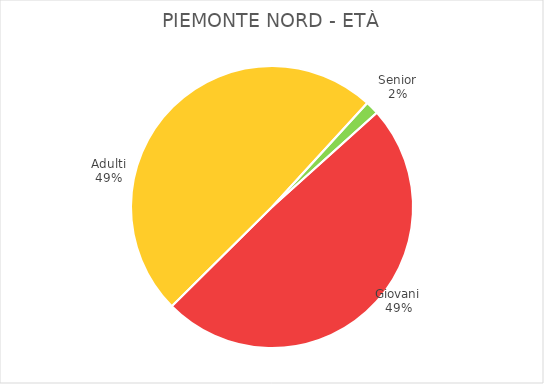
| Category | Piemonte Nord |
|---|---|
| Giovani | 21869 |
| Adulti | 21859 |
| Senior | 680 |